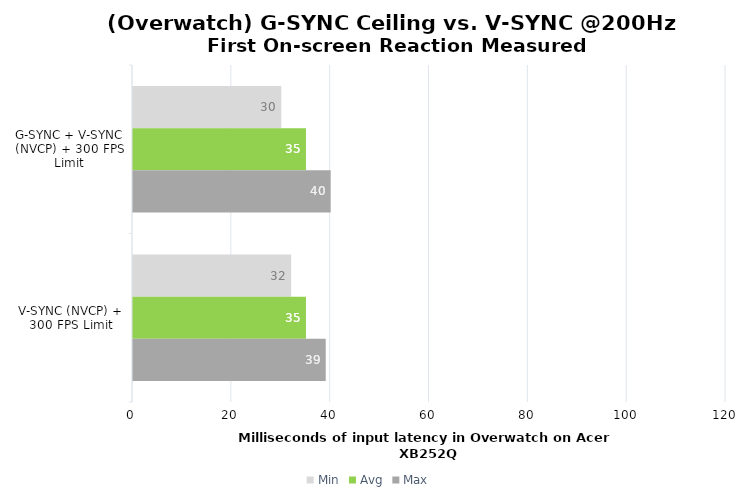
| Category | Min | Avg | Max |
|---|---|---|---|
| G-SYNC + V-SYNC (NVCP) + 300 FPS Limit | 30 | 35 | 40 |
| V-SYNC (NVCP) + 300 FPS Limit | 32 | 35 | 39 |